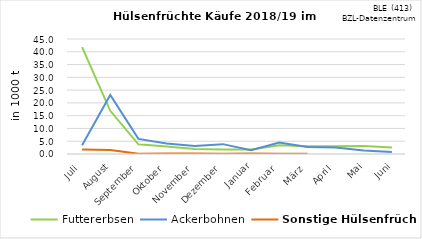
| Category | Futtererbsen | Ackerbohnen | Sonstige Hülsenfrüchte |
|---|---|---|---|
| Juli | 41.792 | 3.421 | 1.733 |
| August | 16.899 | 23.076 | 1.573 |
| September | 3.798 | 5.908 | 0.111 |
| Oktober | 2.927 | 4.076 | 0.193 |
| November | 1.951 | 3.143 | 0.149 |
| Dezember | 1.761 | 3.861 | 0.077 |
| Januar | 1.727 | 1.485 | 0.208 |
| Februar | 3.413 | 4.451 | 0.116 |
| März | 3.063 | 2.724 | 0.063 |
| April | 3.059 | 2.501 | 0 |
| Mai | 3.112 | 1.41 | 0 |
| Juni | 2.537 | 0.758 | 0 |